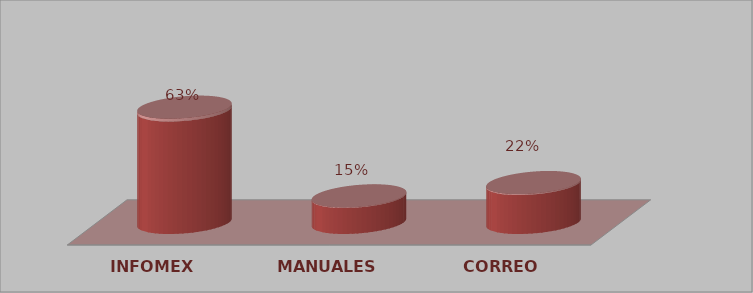
| Category | Series 0 | Series 1 |
|---|---|---|
| INFOMEX | 26 | 0.634 |
| MANUALES | 6 | 0.146 |
| CORREO | 9 | 0.22 |